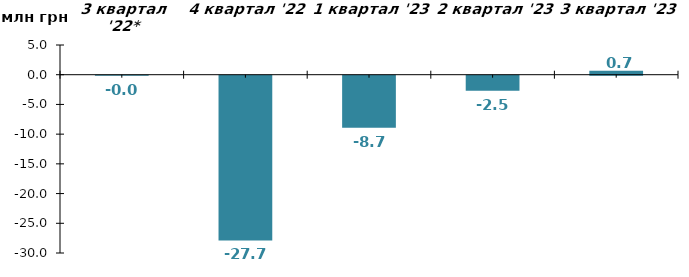
| Category | Чистий притік/відтік за відповідний квартал, млн грн |
|---|---|
| 3 квартал '22* | -0.002 |
| 4 квартал '22 | -27.72 |
| 1 квартал '23 | -8.74 |
| 2 квартал '23 | -2.52 |
| 3 квартал '23 | 0.68 |